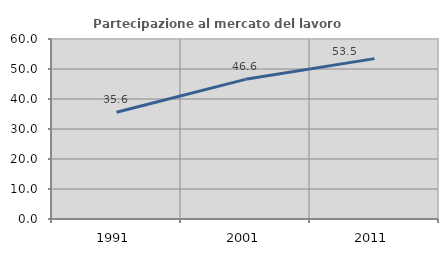
| Category | Partecipazione al mercato del lavoro  femminile |
|---|---|
| 1991.0 | 35.587 |
| 2001.0 | 46.554 |
| 2011.0 | 53.456 |